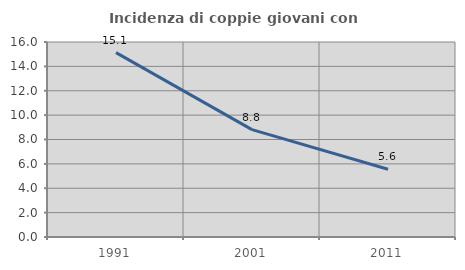
| Category | Incidenza di coppie giovani con figli |
|---|---|
| 1991.0 | 15.129 |
| 2001.0 | 8.812 |
| 2011.0 | 5.556 |